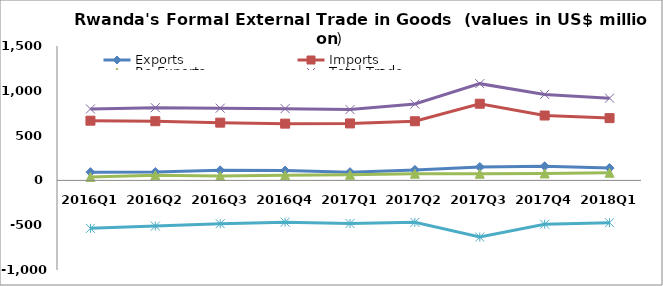
| Category | Exports | Imports | Re-Exports | Total Trade | Trade Balance |
|---|---|---|---|---|---|
| 2016Q1 | 92.097 | 666.431 | 38.936 | 797.464 | -535.397 |
| 2016Q2 | 93.292 | 660.603 | 57.563 | 811.457 | -509.748 |
| 2016Q3 | 112.41 | 644.459 | 49.15 | 806.019 | -482.9 |
| 2016Q4 | 109.497 | 633.547 | 57.935 | 800.978 | -466.115 |
| 2017Q1 | 92.022 | 635.792 | 63.008 | 790.823 | -480.761 |
| 2017Q2 | 117.438 | 660.301 | 74.393 | 852.132 | -468.47 |
| 2017Q3 | 149.648 | 855.748 | 74.341 | 1079.737 | -631.759 |
| 2017Q4 | 157.625 | 724.154 | 77.699 | 959.478 | -488.83 |
| 2018Q1 | 138.148 | 695.167 | 84.902 | 918.217 | -472.118 |